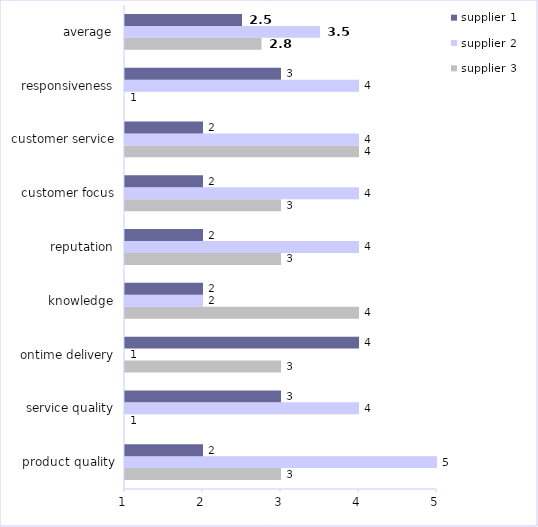
| Category | supplier 3 | supplier 2 | supplier 1 |
|---|---|---|---|
| product quality | 3 | 5 | 2 |
| service quality | 1 | 4 | 3 |
| ontime delivery | 3 | 1 | 4 |
| knowledge | 4 | 2 | 2 |
| reputation | 3 | 4 | 2 |
| customer focus | 3 | 4 | 2 |
| customer service | 4 | 4 | 2 |
| responsiveness | 1 | 4 | 3 |
| average | 2.75 | 3.5 | 2.5 |